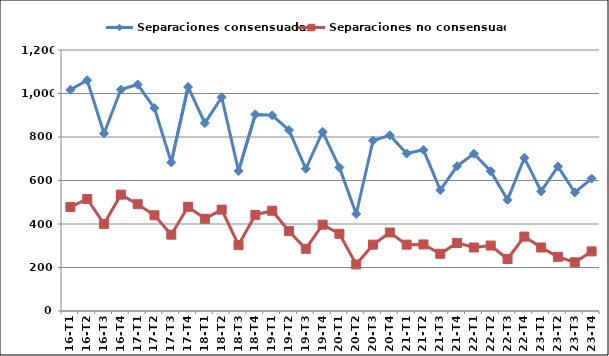
| Category | Separaciones consensuadas | Separaciones no consensuadas |
|---|---|---|
| 16-T1 | 1017 | 478 |
| 16-T2 | 1061 | 515 |
| 16-T3 | 816 | 400 |
| 16-T4 | 1018 | 535 |
| 17-T1 | 1041 | 491 |
| 17-T2 | 933 | 440 |
| 17-T3 | 683 | 351 |
| 17-T4 | 1030 | 479 |
| 18-T1 | 864 | 424 |
| 18-T2 | 983 | 466 |
| 18-T3 | 644 | 303 |
| 18-T4 | 904 | 442 |
| 19-T1 | 900 | 461 |
| 19-T2 | 832 | 367 |
| 19-T3 | 654 | 286 |
| 19-T4 | 824 | 397 |
| 20-T1 | 660 | 355 |
| 20-T2 | 446 | 214 |
| 20-T3 | 783 | 305 |
| 20-T4 | 808 | 361 |
| 21-T1 | 724 | 305 |
| 21-T2 | 741 | 306 |
| 21-T3 | 556 | 263 |
| 21-T4 | 666 | 313 |
| 22-T1 | 723 | 292 |
| 22-T2 | 643 | 301 |
| 22-T3 | 511 | 239 |
| 22-T4 | 704 | 342 |
| 23-T1 | 550 | 292 |
| 23-T2 | 665 | 249 |
| 23-T3 | 545 | 224 |
| 23-T4 | 609 | 274 |